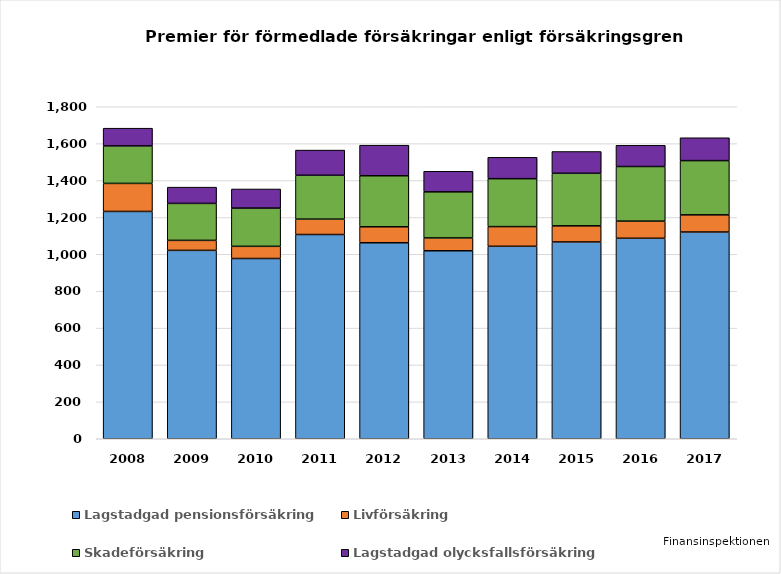
| Category | Lagstadgad pensionsförsäkring | Livförsäkring | Skadeförsäkring | Lagstadgad olycksfallsförsäkring |
|---|---|---|---|---|
| 2008.0 | 1232.449 | 151.996 | 203.425 | 95.962 |
| 2009.0 | 1021.457 | 54.107 | 200.56 | 88.041 |
| 2010.0 | 977.321 | 65.95 | 207.341 | 103.558 |
| 2011.0 | 1107.329 | 83.403 | 238.041 | 136.289 |
| 2012.0 | 1062.705 | 86.597 | 276.62 | 165.706 |
| 2013.0 | 1019.216 | 69.648 | 249.823 | 111.515 |
| 2014.0 | 1043.573 | 106.619 | 259.835 | 115.957 |
| 2015.0 | 1067.062 | 87.285 | 284.943 | 118.153 |
| 2016.0 | 1087 | 93 | 296 | 115 |
| 2017.0 | 1121 | 93 | 294 | 124 |